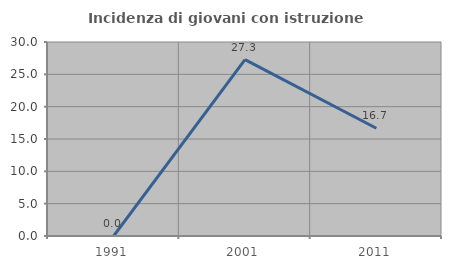
| Category | Incidenza di giovani con istruzione universitaria |
|---|---|
| 1991.0 | 0 |
| 2001.0 | 27.273 |
| 2011.0 | 16.667 |